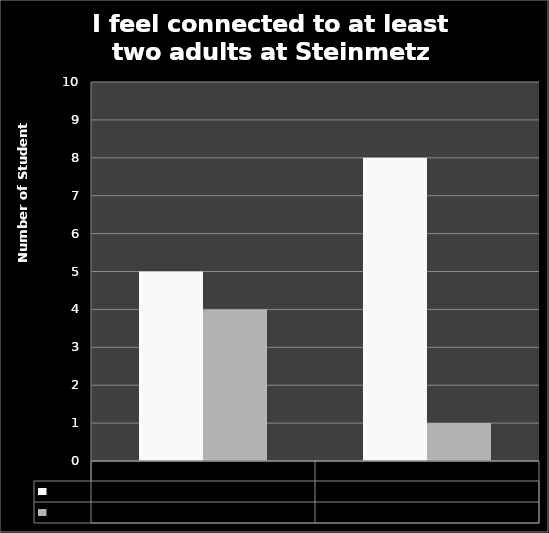
| Category | TRUE | FALSE |
|---|---|---|
| Pre | 5 | 4 |
| Post | 8 | 1 |